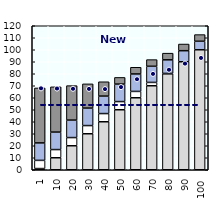
| Category | Gross earnings | Social assistance | Housing benefits | Family benefits | In-work benefits |
|---|---|---|---|---|---|
| 1.0 | 1 | 0 | 6.817 | 14.566 | 45.782 |
| 10.0 | 10 | 0 | 6.817 | 14.566 | 37.719 |
| 20.0 | 20 | 0 | 6.817 | 14.566 | 28.729 |
| 30.0 | 30 | 0 | 6.817 | 14.566 | 20.203 |
| 40.0 | 40 | 0 | 6.817 | 14.566 | 11.955 |
| 50.0 | 50 | 0 | 6.817 | 14.566 | 5.561 |
| 60.0 | 60 | 0 | 5.277 | 14.566 | 5.561 |
| 70.0 | 70 | 0 | 2.778 | 13.457 | 5.561 |
| 80.0 | 80 | 0 | 0.278 | 11.333 | 5.561 |
| 90.0 | 90 | 0 | 0 | 9.207 | 5.561 |
| 100.0 | 100 | 0 | 0 | 7.083 | 5.561 |